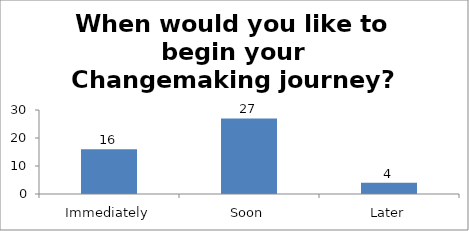
| Category | When would you like to begin your Changemaking journey?  |
|---|---|
| Immediately | 16 |
| Soon | 27 |
| Later | 4 |